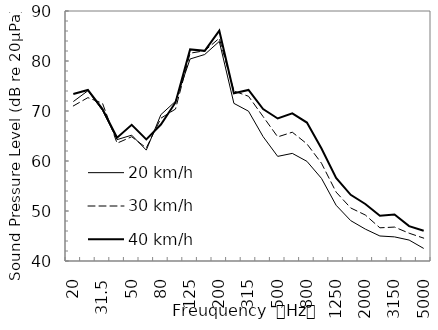
| Category | 20 km/h | 30 km/h | 40 km/h |
|---|---|---|---|
| 20.0 | 71.884 | 71.01 | 73.401 |
| 25.0 | 74.056 | 72.673 | 74.204 |
| 31.5 | 70.091 | 71.545 | 70.379 |
| 40.0 | 64.275 | 63.561 | 64.669 |
| 50.0 | 65.166 | 64.855 | 67.231 |
| 63.0 | 62.176 | 62.613 | 64.328 |
| 80.0 | 69.273 | 68.557 | 67.299 |
| 100.0 | 71.937 | 70.386 | 71.71 |
| 125.0 | 80.404 | 81.565 | 82.322 |
| 160.0 | 81.298 | 82.043 | 82.033 |
| 200.0 | 83.919 | 84.564 | 86.068 |
| 250.0 | 71.525 | 73.986 | 73.557 |
| 315.0 | 69.965 | 72.946 | 74.214 |
| 400.0 | 64.874 | 68.887 | 70.403 |
| 500.0 | 60.922 | 64.824 | 68.506 |
| 630.0 | 61.523 | 65.755 | 69.538 |
| 800.0 | 59.934 | 63.432 | 67.692 |
| 1000.0 | 56.518 | 59.546 | 62.508 |
| 1250.0 | 51.152 | 53.78 | 56.618 |
| 1600.0 | 48.078 | 50.608 | 53.234 |
| 2000.0 | 46.38 | 49.201 | 51.405 |
| 2500.0 | 45.002 | 46.638 | 49.065 |
| 3150.0 | 44.823 | 46.787 | 49.297 |
| 4000.0 | 44.19 | 45.562 | 46.979 |
| 5000.0 | 42.515 | 44.573 | 46.047 |